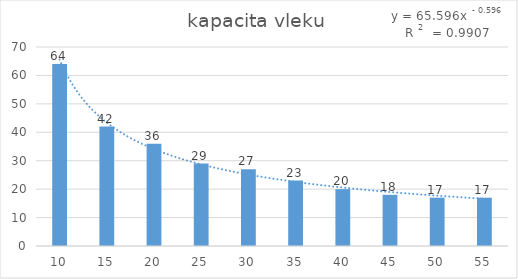
| Category | kapacita vleku |
|---|---|
| 10.0 | 64 |
| 15.0 | 42 |
| 20.0 | 36 |
| 25.0 | 29 |
| 30.0 | 27 |
| 35.0 | 23 |
| 40.0 | 20 |
| 45.0 | 18 |
| 50.0 | 17 |
| 55.0 | 17 |